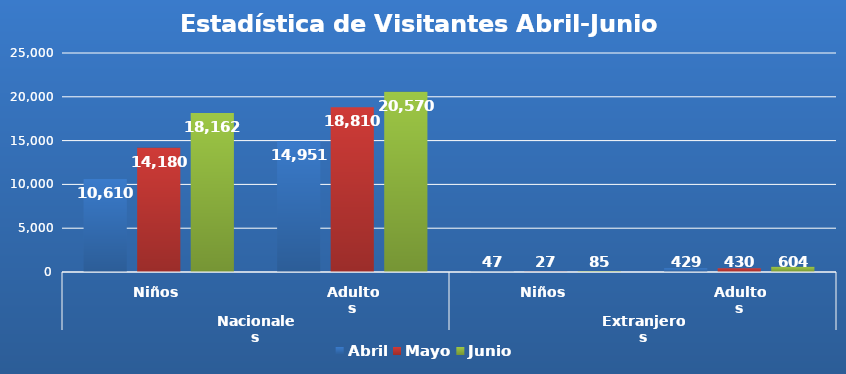
| Category | Abril | Mayo | Junio |
|---|---|---|---|
| 0 | 10610 | 14180 | 18162 |
| 1 | 14951 | 18810 | 20570 |
| 2 | 47 | 27 | 85 |
| 3 | 429 | 430 | 604 |